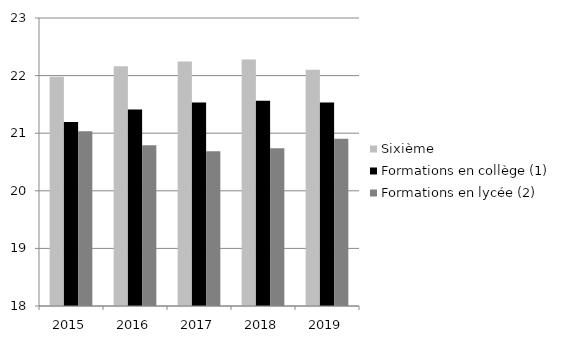
| Category | Sixième | Formations en collège (1) | Formations en lycée (2) |
|---|---|---|---|
| 2015.0 | 21.982 | 21.196 | 21.035 |
| 2016.0 | 22.161 | 21.41 | 20.79 |
| 2017.0 | 22.247 | 21.531 | 20.686 |
| 2018.0 | 22.278 | 21.563 | 20.74 |
| 2019.0 | 22.1 | 21.531 | 20.903 |